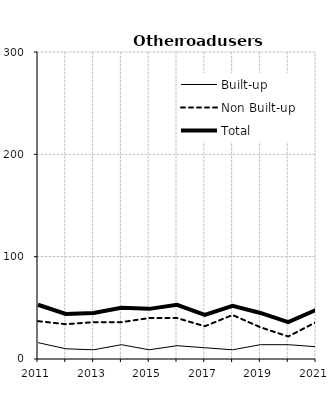
| Category | Built-up | Non Built-up | Total |
|---|---|---|---|
| 2011.0 | 16 | 37 | 53 |
| 2012.0 | 10 | 34 | 44 |
| 2013.0 | 9 | 36 | 45 |
| 2014.0 | 14 | 36 | 50 |
| 2015.0 | 9 | 40 | 49 |
| 2016.0 | 13 | 40 | 53 |
| 2017.0 | 11 | 32 | 43 |
| 2018.0 | 9 | 43 | 52 |
| 2019.0 | 14 | 31 | 45 |
| 2020.0 | 14 | 22 | 36 |
| 2021.0 | 12 | 36 | 48 |